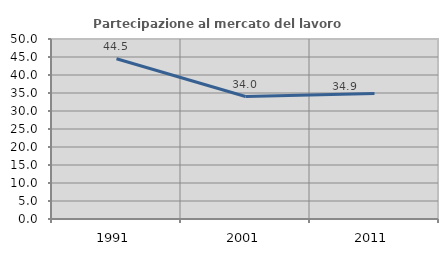
| Category | Partecipazione al mercato del lavoro  femminile |
|---|---|
| 1991.0 | 44.524 |
| 2001.0 | 34.022 |
| 2011.0 | 34.866 |